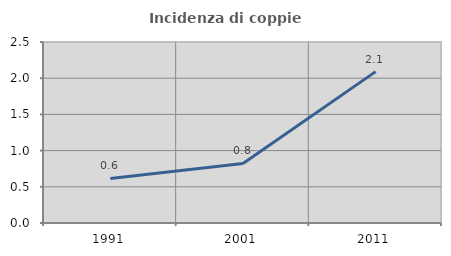
| Category | Incidenza di coppie miste |
|---|---|
| 1991.0 | 0.616 |
| 2001.0 | 0.822 |
| 2011.0 | 2.091 |